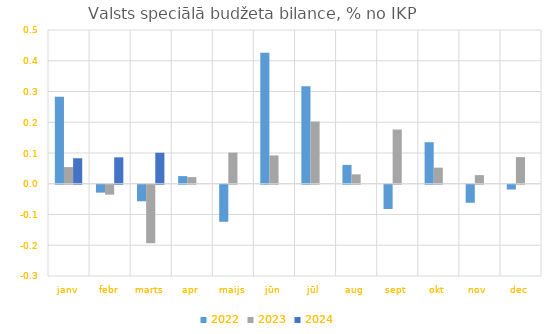
| Category | 2022 | 2023 | 2024 |
|---|---|---|---|
| janv | 0.283 | 0.054 | 0.083 |
| febr | -0.026 | -0.032 | 0.086 |
| marts | -0.054 | -0.19 | 0.101 |
| apr | 0.025 | 0.022 | 0 |
| maijs | -0.12 | 0.101 | 0 |
| jūn | 0.426 | 0.092 | 0 |
| jūl | 0.317 | 0.202 | 0 |
| aug | 0.061 | 0.031 | 0 |
| sept | -0.079 | 0.176 | 0 |
| okt | 0.135 | 0.052 | 0 |
| nov | -0.059 | 0.028 | 0 |
| dec | -0.015 | 0.087 | 0 |